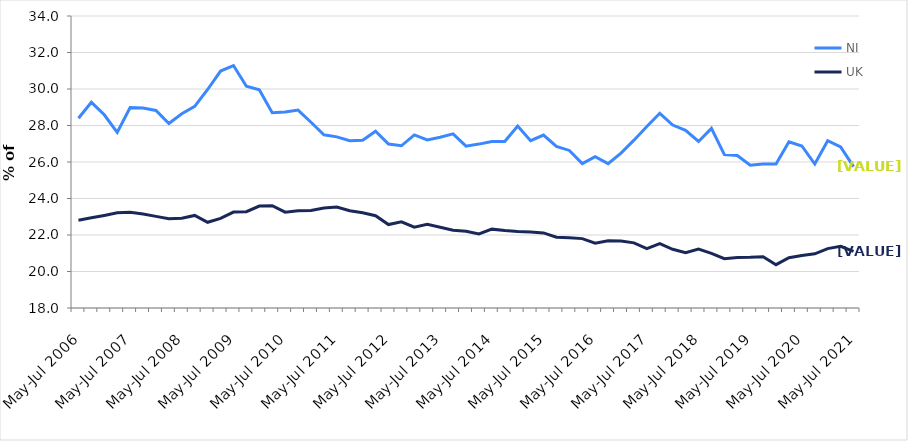
| Category | NI | UK |
|---|---|---|
| May-Jul 2006 | 28.4 | 22.812 |
| Aug-Oct 2006 | 29.27 | 22.94 |
| Nov-Jan 2007 | 28.588 | 23.068 |
| Feb-Apr 2007 | 27.617 | 23.213 |
| May-Jul 2007 | 28.988 | 23.241 |
| Aug-Oct 2007 | 28.956 | 23.15 |
| Nov-Jan 2008 | 28.821 | 23.021 |
| Feb-Apr 2008 | 28.11 | 22.885 |
| May-Jul 2008 | 28.646 | 22.919 |
| Aug-Oct 2008 | 29.05 | 23.071 |
| Nov-Jan 2009 | 29.973 | 22.695 |
| Feb-Apr 2009 | 30.984 | 22.908 |
| May-Jul 2009 | 31.286 | 23.255 |
| Aug-Oct 2009 | 30.153 | 23.274 |
| Nov-Jan 2010 | 29.959 | 23.587 |
| Feb-Apr 2010 | 28.705 | 23.606 |
| May-Jul 2010 | 28.743 | 23.252 |
| Aug-Oct 2010 | 28.847 | 23.329 |
| Nov-Jan 2011 | 28.18 | 23.34 |
| Feb-Apr 2011 | 27.489 | 23.483 |
| May-Jul 2011 | 27.377 | 23.531 |
| Aug-Oct 2011 | 27.166 | 23.331 |
| Nov-Jan 2012 | 27.186 | 23.22 |
| Feb-Apr 2012 | 27.689 | 23.059 |
| May-Jul 2012 | 26.987 | 22.571 |
| Aug-Oct 2012 | 26.889 | 22.723 |
| Nov-Jan 2013 | 27.482 | 22.425 |
| Feb-Apr 2013 | 27.21 | 22.581 |
| May-Jul 2013 | 27.354 | 22.426 |
| Aug-Oct 2013 | 27.54 | 22.259 |
| Nov-Jan 2014 | 26.87 | 22.208 |
| Feb-Apr 2014 | 26.981 | 22.061 |
| May-Jul 2014 | 27.124 | 22.321 |
| Aug-Oct 2014 | 27.129 | 22.242 |
| Nov-Jan 2015 | 27.967 | 22.193 |
| Feb-Apr 2015 | 27.171 | 22.171 |
| May-Jul 2015 | 27.477 | 22.116 |
| Aug-Oct 2015 | 26.855 | 21.877 |
| Nov-Jan 2016 | 26.633 | 21.845 |
| Feb-Apr 2016 | 25.909 | 21.802 |
| May-Jul 2016 | 26.289 | 21.555 |
| Aug-Oct 2016 | 25.912 | 21.681 |
| Nov-Jan 2017 | 26.491 | 21.675 |
| Feb-Apr 2017 | 27.196 | 21.569 |
| May-Jul 2017 | 27.942 | 21.257 |
| Aug-Oct 2017 | 28.67 | 21.525 |
| Nov-Jan 2018 | 28.024 | 21.217 |
| Feb-Apr 2018 | 27.736 | 21.024 |
| May-Jul 2018 | 27.123 | 21.23 |
| Aug-Oct 2018 | 27.845 | 20.997 |
| Nov-Jan 2019 | 26.406 | 20.704 |
| Feb-Apr 2019 | 26.357 | 20.771 |
| May-Jul 2019 | 25.826 | 20.776 |
| Aug-Oct 2019 | 25.894 | 20.809 |
| Nov-Jan 2020 | 25.896 | 20.374 |
| Feb-Apr 2020 | 27.107 | 20.754 |
| May-Jul 2020 | 26.878 | 20.878 |
| Aug-Oct 2020 | 25.888 | 20.969 |
| Nov-Jan 2021 | 27.168 | 21.256 |
| Feb-Apr 2021 | 26.822 | 21.381 |
| May-Jul 2021 | 25.746 | 21.102 |